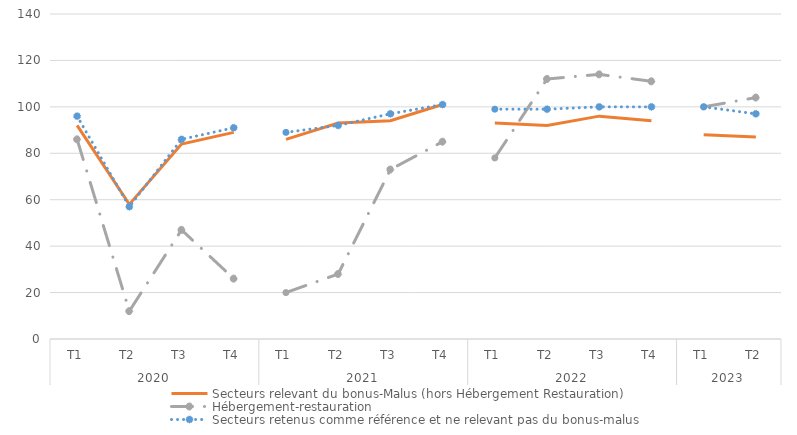
| Category | Secteurs relevant du bonus-Malus (hors Hébergement Restauration) | Hébergement-restauration | Secteurs retenus comme référence et ne relevant pas du bonus-malus |
|---|---|---|---|
| 0 | 92 | 86 | 96 |
| 1 | 58 | 12 | 57 |
| 2 | 84 | 47 | 86 |
| 3 | 89 | 26 | 91 |
| 4 | 86 | 20 | 89 |
| 5 | 93 | 28 | 92 |
| 6 | 94 | 73 | 97 |
| 7 | 101 | 85 | 101 |
| 8 | 93 | 78 | 99 |
| 9 | 92 | 112 | 99 |
| 10 | 96 | 114 | 100 |
| 11 | 94 | 111 | 100 |
| 12 | 88 | 100 | 100 |
| 13 | 87 | 104 | 97 |